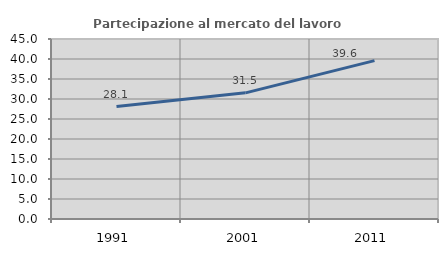
| Category | Partecipazione al mercato del lavoro  femminile |
|---|---|
| 1991.0 | 28.099 |
| 2001.0 | 31.536 |
| 2011.0 | 39.604 |